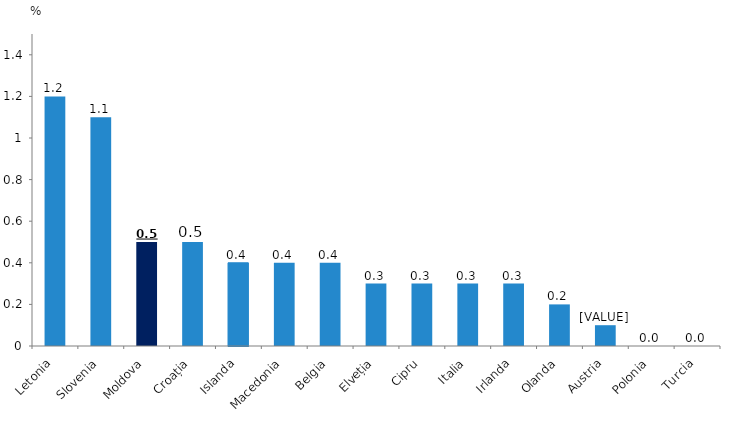
| Category | Series 0 |
|---|---|
| Letonia | 1.2 |
| Slovenia | 1.1 |
| Moldova | 0.5 |
| Croația | 0.5 |
| Islanda | 0.4 |
| Macedonia | 0.4 |
| Belgia | 0.4 |
| Elveția | 0.3 |
| Cipru | 0.3 |
| Italia | 0.3 |
| Irlanda | 0.3 |
| Olanda | 0.2 |
| Austria | 0.1 |
| Polonia | 0 |
| Turcia | 0 |